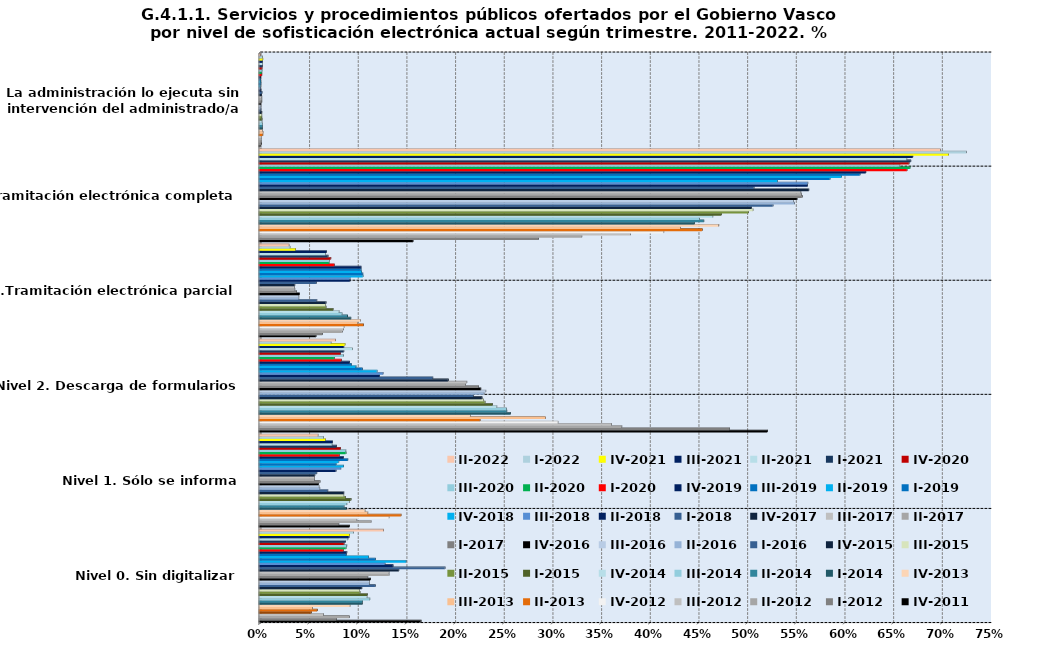
| Category | IV-2011 | I-2012 | II-2012 | III-2012 | IV-2012 | II-2013 | III-2013 | IV-2013 | I-2014 | II-2014 | III-2014 | IV-2014 | I-2015 | II-2015 | III-2015 | IV-2015 | I-2016 | II-2016 | III-2016 | IV-2016 | I-2017 | II-2017 | III-2017 | IV-2017 | I-2018 | II-2018 | III-2018 | IV-2018 | I-2019 | II-2019 | III-2019 | IV-2019 | I-2020 | II-2020 | III-2020 | IV-2020 | I-2021 | II-2021 | III-2021 | IV-2021 | I-2022 | II-2022 |
|---|---|---|---|---|---|---|---|---|---|---|---|---|---|---|---|---|---|---|---|---|---|---|---|---|---|---|---|---|---|---|---|---|---|---|---|---|---|---|---|---|---|---|
| Nivel 0. Sin digitalizar | 0.166 | 0.079 | 0.093 | 0.066 | 0.054 | 0.06 | 0.055 | 0.094 | 0.106 | 0.106 | 0.114 | 0.111 | 0.111 | 0.104 | 0.103 | 0.106 | 0.119 | 0.113 | 0.113 | 0.115 | 0.112 | 0.134 | 0.134 | 0.144 | 0.191 | 0.138 | 0.13 | 0.151 | 0.12 | 0.113 | 0.09 | 0.09 | 0.087 | 0.089 | 0.09 | 0.087 | 0.089 | 0.091 | 0.093 | 0.093 | 0.097 | 0.128 |
| Nivel 1. Sólo se informa | 0.093 | 0.082 | 0.115 | 0.101 | 0.134 | 0.146 | 0.112 | 0.109 | 0.09 | 0.087 | 0.09 | 0.093 | 0.095 | 0.089 | 0.087 | 0.087 | 0.071 | 0.063 | 0.062 | 0.061 | 0.063 | 0.057 | 0.057 | 0.057 | 0.06 | 0.079 | 0.084 | 0.087 | 0.079 | 0.082 | 0.091 | 0.087 | 0.083 | 0.089 | 0.089 | 0.084 | 0.08 | 0.075 | 0.076 | 0.068 | 0.066 | 0.061 |
| Nivel 2. Descarga de formularios | 0.522 | 0.483 | 0.373 | 0.362 | 0.307 | 0.227 | 0.294 | 0.217 | 0.258 | 0.255 | 0.254 | 0.244 | 0.24 | 0.232 | 0.231 | 0.229 | 0.22 | 0.231 | 0.233 | 0.228 | 0.226 | 0.212 | 0.213 | 0.194 | 0.179 | 0.124 | 0.128 | 0.121 | 0.106 | 0.1 | 0.095 | 0.093 | 0.085 | 0.077 | 0.087 | 0.084 | 0.087 | 0.096 | 0.087 | 0.088 | 0.074 | 0.079 |
| Nivel 3.Tramitación electrónica parcial | 0.059 | 0.065 | 0.086 | 0.087 | 0.087 | 0.108 | 0.102 | 0.104 | 0.094 | 0.091 | 0.085 | 0.082 | 0.076 | 0.069 | 0.068 | 0.069 | 0.059 | 0.041 | 0.041 | 0.042 | 0.039 | 0.037 | 0.036 | 0.037 | 0.059 | 0.094 | 0.094 | 0.107 | 0.107 | 0.106 | 0.105 | 0.105 | 0.077 | 0.072 | 0.072 | 0.074 | 0.071 | 0.068 | 0.069 | 0.038 | 0.032 | 0.031 |
| Nivel 4 Tramitación electrónica completa | 0.158 | 0.287 | 0.332 | 0.382 | 0.416 | 0.455 | 0.433 | 0.472 | 0.447 | 0.457 | 0.453 | 0.466 | 0.475 | 0.503 | 0.508 | 0.506 | 0.528 | 0.55 | 0.549 | 0.553 | 0.558 | 0.557 | 0.557 | 0.565 | 0.509 | 0.564 | 0.564 | 0.532 | 0.587 | 0.598 | 0.617 | 0.623 | 0.666 | 0.669 | 0.658 | 0.668 | 0.67 | 0.665 | 0.672 | 0.709 | 0.727 | 0.7 |
| Nivel 5. La administración lo ejecuta sin intervención del administrado/a | 0.001 | 0.003 | 0.002 | 0.002 | 0.002 | 0.004 | 0.004 | 0.004 | 0.004 | 0.003 | 0.003 | 0.003 | 0.003 | 0.003 | 0.003 | 0.003 | 0.002 | 0.002 | 0.002 | 0.002 | 0.003 | 0.003 | 0.003 | 0.003 | 0.003 | 0.002 | 0.001 | 0.001 | 0.002 | 0.002 | 0.002 | 0.002 | 0.003 | 0.003 | 0.003 | 0.003 | 0.003 | 0.004 | 0.004 | 0.004 | 0.004 | 0.002 |